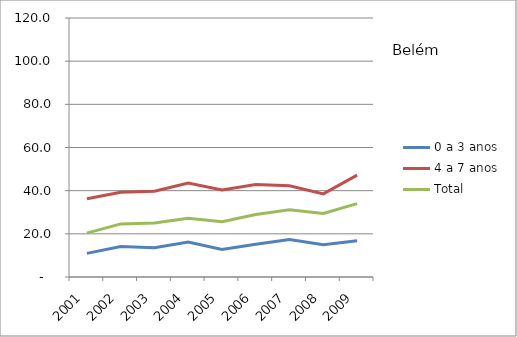
| Category | 0 a 3 anos | 4 a 7 anos | Total |
|---|---|---|---|
| 2001.0 | 10.95 | 36.27 | 20.34 |
| 2002.0 | 14.15 | 39.25 | 24.6 |
| 2003.0 | 13.55 | 39.7 | 25.04 |
| 2004.0 | 16.25 | 43.52 | 27.19 |
| 2005.0 | 12.79 | 40.29 | 25.63 |
| 2006.0 | 15.13 | 42.82 | 28.99 |
| 2007.0 | 17.41 | 42.29 | 31.19 |
| 2008.0 | 14.9 | 38.52 | 29.45 |
| 2009.0 | 16.81 | 47.21 | 34.01 |